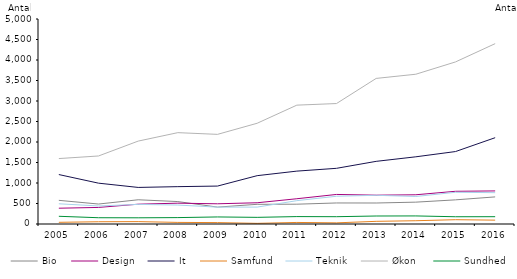
| Category | Bio | Design | It | Samfund | Teknik | Økon  | Sundhed |
|---|---|---|---|---|---|---|---|
| 2005.0 | 577 | 385 | 1206 | 41 | 493 | 1596 | 188 |
| 2006.0 | 487 | 404 | 996 | 55 | 440 | 1659 | 153 |
| 2007.0 | 591 | 483 | 892 | 58 | 478 | 2022 | 151 |
| 2008.0 | 547 | 508 | 911 | 39 | 462 | 2228 | 156 |
| 2009.0 | 412 | 493 | 925 | 34 | 411 | 2186 | 172 |
| 2010.0 | 480 | 518 | 1179 | 16 | 412 | 2457 | 162 |
| 2011.0 | 483 | 616 | 1290 | 38 | 569 | 2899 | 181 |
| 2012.0 | 513 | 721 | 1358 | 28 | 677 | 2938 | 178 |
| 2013.0 | 512 | 703 | 1528 | 65 | 700 | 3551 | 195 |
| 2014.0 | 533 | 713 | 1639 | 80 | 671 | 3653 | 197 |
| 2015.0 | 589 | 798 | 1767 | 105 | 774 | 3953 | 177 |
| 2016.0 | 661 | 807 | 2105 | 94 | 764 | 4399 | 178 |